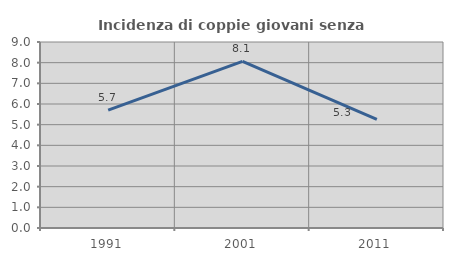
| Category | Incidenza di coppie giovani senza figli |
|---|---|
| 1991.0 | 5.707 |
| 2001.0 | 8.061 |
| 2011.0 | 5.253 |